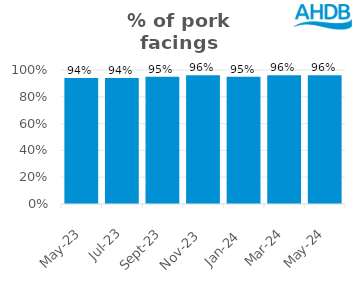
| Category | Pork |
|---|---|
| 2023-05-01 | 0.94 |
| 2023-07-01 | 0.94 |
| 2023-09-01 | 0.95 |
| 2023-11-01 | 0.96 |
| 2024-01-01 | 0.95 |
| 2024-03-01 | 0.96 |
| 2024-05-01 | 0.96 |